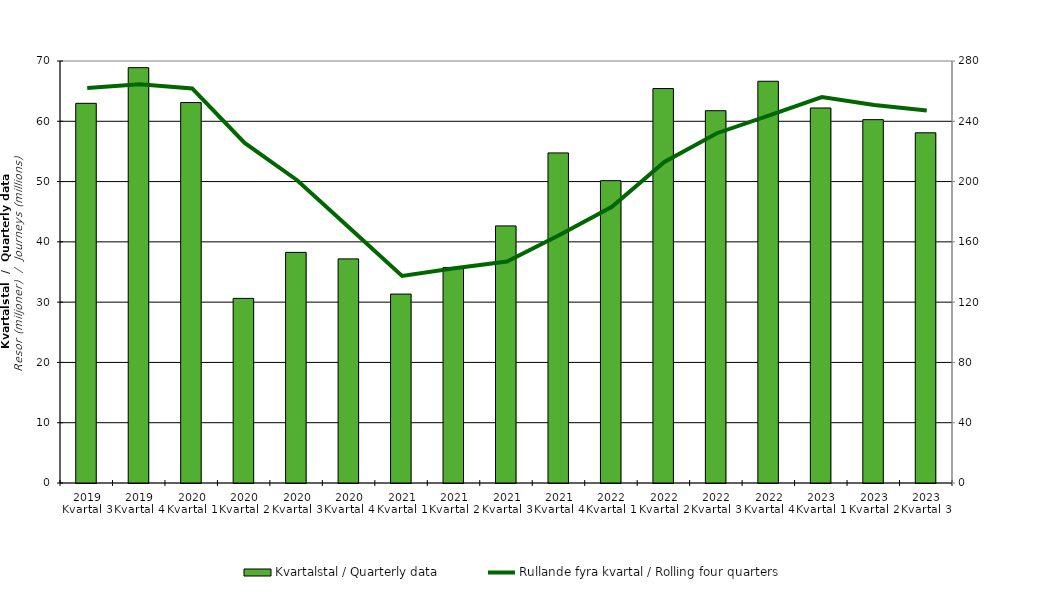
| Category | Kvartalstal / Quarterly data |
|---|---|
| 2019 Kvartal 3 | 62.979 |
| 2019 Kvartal 4 | 68.898 |
| 2020 Kvartal 1 | 63.109 |
| 2020 Kvartal 2 | 30.624 |
| 2020 Kvartal 3 | 38.255 |
| 2020 Kvartal 4 | 37.175 |
| 2021 Kvartal 1 | 31.339 |
| 2021 Kvartal 2 | 35.757 |
| 2021 Kvartal 3 | 42.645 |
| 2021 Kvartal 4 | 54.75 |
| 2022 Kvartal 1 | 50.15 |
| 2022 Kvartal 2 | 65.43 |
| 2022 Kvartal 3 | 61.753 |
| 2022 Kvartal 4 | 66.639 |
| 2023 Kvartal 1 | 62.204 |
| 2023 Kvartal 2 | 60.272 |
| 2023 Kvartal 3 | 58.093 |